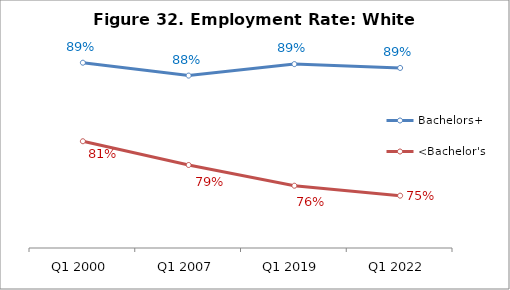
| Category | Bachelors+ | <Bachelor's |
|---|---|---|
| Q1 2000 | 0.893 | 0.811 |
| Q1 2007 | 0.88 | 0.786 |
| Q1 2019 | 0.892 | 0.765 |
| Q1 2022 | 0.888 | 0.755 |